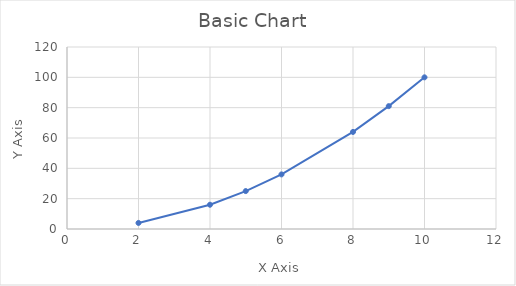
| Category | Y |
|---|---|
| 2.0 | 4 |
| 4.0 | 16 |
| 5.0 | 25 |
| 6.0 | 36 |
| 8.0 | 64 |
| 9.0 | 81 |
| 10.0 | 100 |